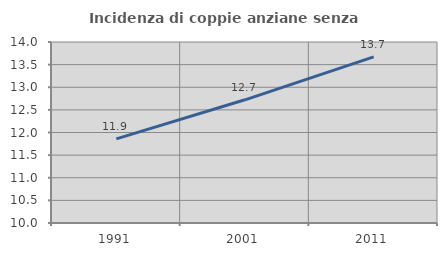
| Category | Incidenza di coppie anziane senza figli  |
|---|---|
| 1991.0 | 11.86 |
| 2001.0 | 12.723 |
| 2011.0 | 13.672 |